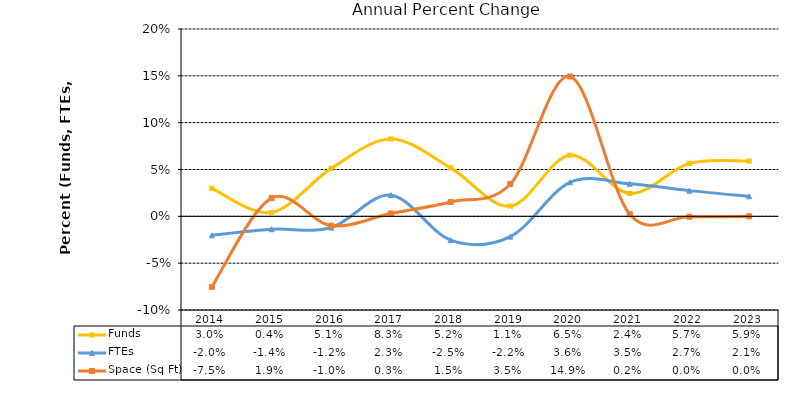
| Category | Funds | FTEs | Space (Sq Ft) |
|---|---|---|---|
| 2014.0 | 0.03 | -0.02 | -0.075 |
| 2015.0 | 0.004 | -0.014 | 0.019 |
| 2016.0 | 0.051 | -0.012 | -0.01 |
| 2017.0 | 0.083 | 0.023 | 0.003 |
| 2018.0 | 0.052 | -0.025 | 0.015 |
| 2019.0 | 0.011 | -0.022 | 0.035 |
| 2020.0 | 0.065 | 0.036 | 0.149 |
| 2021.0 | 0.024 | 0.035 | 0.002 |
| 2022.0 | 0.057 | 0.027 | 0 |
| 2023.0 | 0.059 | 0.021 | 0 |